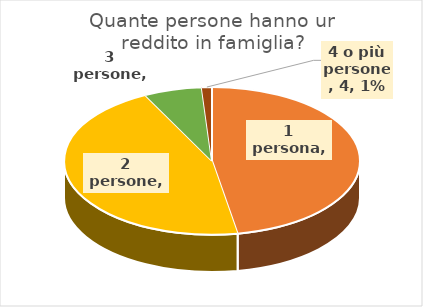
| Category | Series 0 |
|---|---|
| 1 persona | 171 |
| 2 persone | 164 |
| 3 persone | 23 |
| 4 o più persone | 4 |